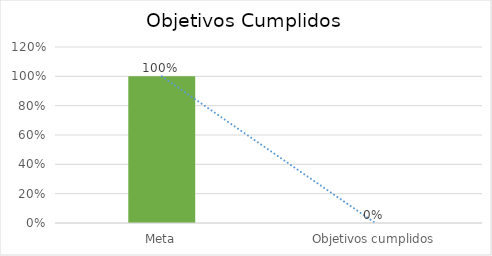
| Category | Series 0 |
|---|---|
| Meta | 1 |
| Objetivos cumplidos | 0 |